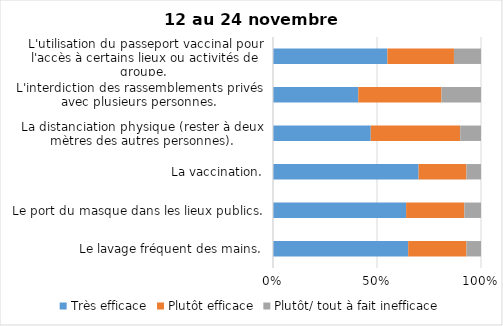
| Category | Très efficace | Plutôt efficace | Plutôt/ tout à fait inefficace |
|---|---|---|---|
| Le lavage fréquent des mains. | 65 | 28 | 7 |
| Le port du masque dans les lieux publics. | 64 | 28 | 8 |
| La vaccination. | 70 | 23 | 7 |
| La distanciation physique (rester à deux mètres des autres personnes). | 47 | 43 | 10 |
| L'interdiction des rassemblements privés avec plusieurs personnes. | 41 | 40 | 19 |
| L'utilisation du passeport vaccinal pour l'accès à certains lieux ou activités de groupe.  | 55 | 32 | 13 |